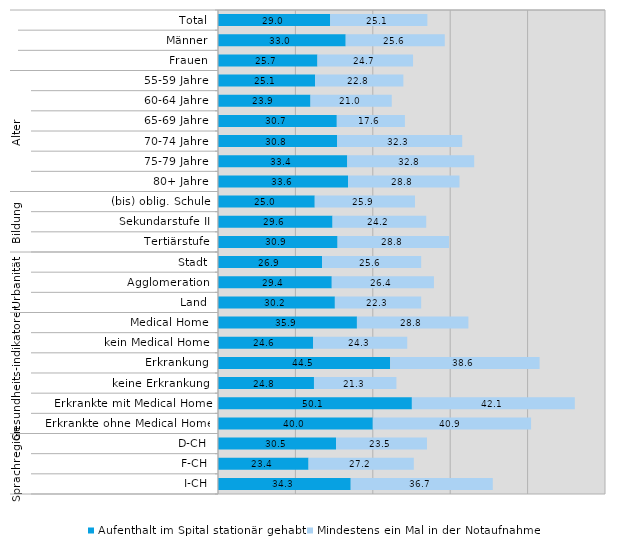
| Category | Aufenthalt im Spital stationär gehabt | Mindestens ein Mal in der Notaufnahme |
|---|---|---|
| 0 | 29 | 25.1 |
| 1 | 33 | 25.6 |
| 2 | 25.7 | 24.7 |
| 3 | 25.1 | 22.8 |
| 4 | 23.9 | 21 |
| 5 | 30.7 | 17.6 |
| 6 | 30.8 | 32.3 |
| 7 | 33.4 | 32.8 |
| 8 | 33.6 | 28.8 |
| 9 | 25 | 25.9 |
| 10 | 29.6 | 24.2 |
| 11 | 30.9 | 28.8 |
| 12 | 26.9 | 25.6 |
| 13 | 29.4 | 26.4 |
| 14 | 30.2 | 22.3 |
| 15 | 35.9 | 28.8 |
| 16 | 24.6 | 24.3 |
| 17 | 44.5 | 38.6 |
| 18 | 24.8 | 21.3 |
| 19 | 50.1 | 42.1 |
| 20 | 40 | 40.9 |
| 21 | 30.5 | 23.5 |
| 22 | 23.4 | 27.2 |
| 23 | 34.3 | 36.7 |